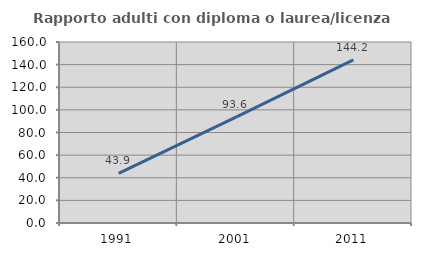
| Category | Rapporto adulti con diploma o laurea/licenza media  |
|---|---|
| 1991.0 | 43.949 |
| 2001.0 | 93.642 |
| 2011.0 | 144.218 |